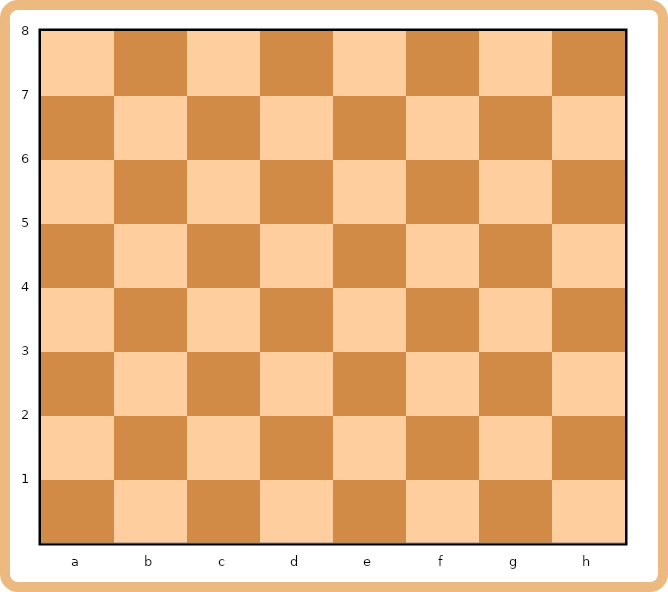
| Category | Serie1a | Serie1b | Serie10 | Serie11 | Serie12 | Serie2a | Serie2b | Serie20 | Serie21 | Serie22 | Serie3a | Serie3b | Serie30 | Serie31 | Serie32 | Serie4a | Serie4b | Serie40 | Serie41 | Serie42 | Serie5a | Serie5b | Serie50 | Serie51 | Serie52 | Serie6a | Serie6b | Serie60 | Serie61 | Serie62 | Serie7a | Serie7b | Serie70 | Serie71 | Serie72 | Serie8a | Serie8b | Serie80 | Serie81 | Serie82 |
|---|---|---|---|---|---|---|---|---|---|---|---|---|---|---|---|---|---|---|---|---|---|---|---|---|---|---|---|---|---|---|---|---|---|---|---|---|---|---|---|---|
| a | 0 | 0 | 0 | 0 | 1 | 0 | 0 | 1 | 0 | 0 | 0 | 0 | 0 | 0 | 1 | 0 | 0 | 1 | 0 | 0 | 0 | 0 | 0 | 0 | 1 | 0 | 0 | 1 | 0 | 0 | 0 | 0 | 0 | 0 | 1 | 0 | 0 | 1 | 0 | 0 |
| b | 0 | 0 | 1 | 0 | 0 | 0 | 0 | 0 | 0 | 1 | 0 | 0 | 1 | 0 | 0 | 0 | 0 | 0 | 0 | 1 | 0 | 0 | 1 | 0 | 0 | 0 | 0 | 0 | 0 | 1 | 0 | 0 | 1 | 0 | 0 | 0 | 0 | 0 | 0 | 1 |
| c | 0 | 0 | 0 | 0 | 1 | 0 | 0 | 1 | 0 | 0 | 0 | 0 | 0 | 0 | 1 | 0 | 0 | 1 | 0 | 0 | 0 | 0 | 0 | 0 | 1 | 0 | 0 | 1 | 0 | 0 | 0 | 0 | 0 | 0 | 1 | 0 | 0 | 1 | 0 | 0 |
| d | 0 | 0 | 1 | 0 | 0 | 0 | 0 | 0 | 0 | 1 | 0 | 0 | 1 | 0 | 0 | 0 | 0 | 0 | 0 | 1 | 0 | 0 | 1 | 0 | 0 | 0 | 0 | 0 | 0 | 1 | 0 | 0 | 1 | 0 | 0 | 0 | 0 | 0 | 0 | 1 |
| e | 0 | 0 | 0 | 0 | 1 | 0 | 0 | 1 | 0 | 0 | 0 | 0 | 0 | 0 | 1 | 0 | 0 | 1 | 0 | 0 | 0 | 0 | 0 | 0 | 1 | 0 | 0 | 1 | 0 | 0 | 0 | 0 | 0 | 0 | 1 | 0 | 0 | 1 | 0 | 0 |
| f | 0 | 0 | 1 | 0 | 0 | 0 | 0 | 0 | 0 | 1 | 0 | 0 | 1 | 0 | 0 | 0 | 0 | 0 | 0 | 1 | 0 | 0 | 1 | 0 | 0 | 0 | 0 | 0 | 0 | 1 | 0 | 0 | 1 | 0 | 0 | 0 | 0 | 0 | 0 | 1 |
| g | 0 | 0 | 0 | 0 | 1 | 0 | 0 | 1 | 0 | 0 | 0 | 0 | 0 | 0 | 1 | 0 | 0 | 1 | 0 | 0 | 0 | 0 | 0 | 0 | 1 | 0 | 0 | 1 | 0 | 0 | 0 | 0 | 0 | 0 | 1 | 0 | 0 | 1 | 0 | 0 |
| h | 0 | 0 | 1 | 0 | 0 | 0 | 0 | 0 | 0 | 1 | 0 | 0 | 1 | 0 | 0 | 0 | 0 | 0 | 0 | 1 | 0 | 0 | 1 | 0 | 0 | 0 | 0 | 0 | 0 | 1 | 0 | 0 | 1 | 0 | 0 | 0 | 0 | 0 | 0 | 1 |